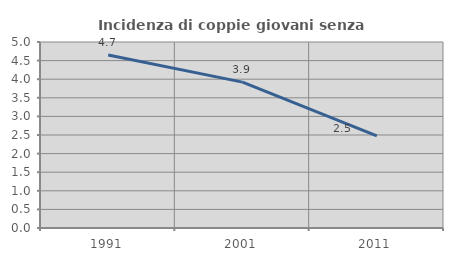
| Category | Incidenza di coppie giovani senza figli |
|---|---|
| 1991.0 | 4.651 |
| 2001.0 | 3.922 |
| 2011.0 | 2.477 |